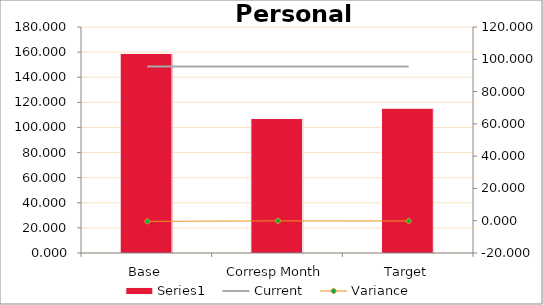
| Category | Series 0 |
|---|---|
| Base | 158.91 |
| Corresp Month | 107.095 |
| Target | 115.267 |